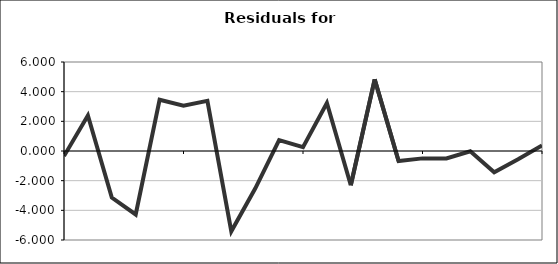
| Category | Series 0 |
|---|---|
| 0 | -0.343 |
| 1 | 2.389 |
| 2 | -3.14 |
| 3 | -4.28 |
| 4 | 3.456 |
| 5 | 3.059 |
| 6 | 3.382 |
| 7 | -5.417 |
| 8 | -2.532 |
| 9 | 0.733 |
| 10 | 0.255 |
| 11 | 3.235 |
| 12 | -2.309 |
| 13 | 4.832 |
| 14 | -0.674 |
| 15 | -0.498 |
| 16 | -0.504 |
| 17 | -0.022 |
| 18 | -1.433 |
| 19 | -0.558 |
| 20 | 0.37 |